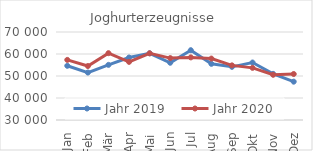
| Category | Jahr 2019 | Jahr 2020 |
|---|---|---|
| Jan | 54639.625 | 57322.322 |
| Feb | 51561.892 | 54527.708 |
| Mär | 55058.99 | 60373.414 |
| Apr | 58398.238 | 56418.477 |
| Mai | 60324.147 | 60306.968 |
| Jun | 56016.859 | 58138.312 |
| Jul | 61723.633 | 58459.47 |
| Aug | 55532.517 | 57919.309 |
| Sep | 54160.403 | 54833.066 |
| Okt | 56123.685 | 53703.85 |
| Nov | 50969.89 | 50553.34 |
| Dez | 47424.873 | 50901.461 |